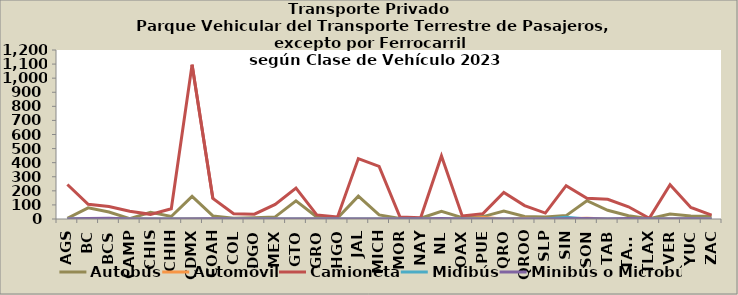
| Category | Autobús | Automóvil | Camioneta | Midibús | Minibús o Microbús |
|---|---|---|---|---|---|
| AGS | 5 | 0 | 245 | 0 | 0 |
| BC | 79 | 1 | 104 | 1 | 3 |
| BCS | 50 | 0 | 88 | 1 | 5 |
| CAMP | 3 | 2 | 55 | 0 | 0 |
| CHIS | 48 | 0 | 33 | 0 | 0 |
| CHIH | 18 | 0 | 73 | 0 | 0 |
| CDMX | 161 | 2 | 1096 | 0 | 0 |
| COAH | 22 | 0 | 146 | 0 | 2 |
| COL | 6 | 0 | 38 | 0 | 0 |
| DGO | 9 | 0 | 34 | 0 | 0 |
| MEX | 15 | 0 | 104 | 0 | 0 |
| GTO | 129 | 0 | 220 | 0 | 0 |
| GRO | 14 | 1 | 29 | 0 | 0 |
| HGO | 7 | 0 | 15 | 0 | 0 |
| JAL | 162 | 0 | 429 | 0 | 0 |
| MICH | 29 | 0 | 374 | 0 | 0 |
| MOR | 4 | 0 | 15 | 0 | 0 |
| NAY | 5 | 0 | 9 | 0 | 0 |
| NL | 54 | 0 | 448 | 0 | 3 |
| OAX | 10 | 0 | 22 | 0 | 0 |
| PUE | 17 | 10 | 38 | 0 | 0 |
| QRO | 56 | 0 | 188 | 0 | 0 |
| QROO | 18 | 5 | 95 | 0 | 0 |
| SLP | 15 | 0 | 42 | 0 | 0 |
| SIN | 24 | 1 | 237 | 12 | 1 |
| SON | 130 | 5 | 147 | 0 | 4 |
| TAB | 62 | 0 | 140 | 0 | 0 |
| TAMS | 23 | 0 | 87 | 0 | 3 |
| TLAX | 2 | 0 | 5 | 0 | 0 |
| VER | 35 | 1 | 244 | 0 | 0 |
| YUC | 22 | 0 | 82 | 0 | 1 |
| ZAC | 19 | 0 | 28 | 0 | 0 |